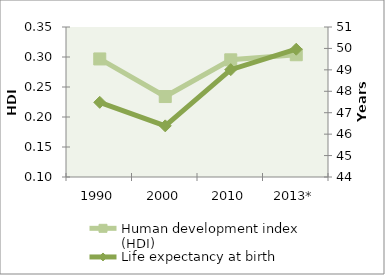
| Category | Human development index (HDI) |
|---|---|
| 1990 | 0.297 |
| 2000 | 0.234 |
| 2010 | 0.295 |
| 2013* | 0.304 |